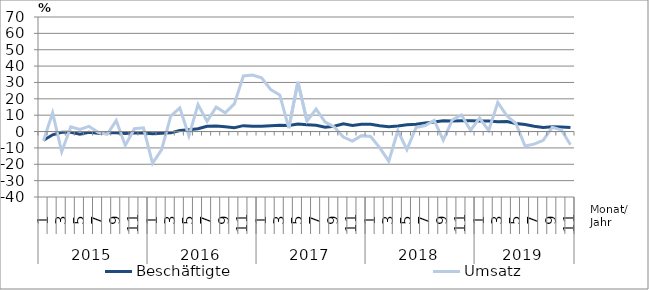
| Category | Beschäftigte | Umsatz |
|---|---|---|
| 0 | -5.3 | -5.5 |
| 1 | -2 | 11.4 |
| 2 | -0.5 | -12.4 |
| 3 | -0.5 | 2.9 |
| 4 | -1.7 | 1.3 |
| 5 | -0.5 | 3.2 |
| 6 | -1.1 | -0.5 |
| 7 | -0.8 | -1.7 |
| 8 | -0.7 | 6.7 |
| 9 | -1.2 | -8.5 |
| 10 | -0.7 | 1.7 |
| 11 | -0.9 | 2.3 |
| 12 | -1.3 | -19.4 |
| 13 | -1.1 | -11 |
| 14 | -0.8 | 9.4 |
| 15 | 0.6 | 14.4 |
| 16 | 1.1 | -2.6 |
| 17 | 1.7 | 16.5 |
| 18 | 3.2 | 6.3 |
| 19 | 3.4 | 14.9 |
| 20 | 3 | 11.4 |
| 21 | 2.4 | 16.9 |
| 22 | 3.6 | 34 |
| 23 | 3.2 | 34.5 |
| 24 | 3.3 | 32.8 |
| 25 | 3.6 | 25.7 |
| 26 | 3.9 | 22.4 |
| 27 | 3.7 | 2.1 |
| 28 | 4.6 | 30.4 |
| 29 | 4.2 | 6.4 |
| 30 | 3.8 | 13.7 |
| 31 | 2.7 | 5.8 |
| 32 | 3.3 | 2.8 |
| 33 | 4.7 | -3.4 |
| 34 | 3.7 | -5.8 |
| 35 | 4.4 | -2.5 |
| 36 | 4.5 | -3 |
| 37 | 3.6 | -9.8 |
| 38 | 2.9 | -18.1 |
| 39 | 3.4 | 0.5 |
| 40 | 4.2 | -11 |
| 41 | 4.5 | 2.5 |
| 42 | 5.3 | 3.7 |
| 43 | 5.8 | 6.8 |
| 44 | 6.6 | -5.2 |
| 45 | 6.5 | 7.1 |
| 46 | 6.6 | 10.1 |
| 47 | 6.6 | 0.8 |
| 48 | 6.4 | 8.2 |
| 49 | 6.5 | 0.6 |
| 50 | 6 | 17.8 |
| 51 | 6.1 | 9.6 |
| 52 | 4.9 | 4.9 |
| 53 | 4.3 | -8.8 |
| 54 | 3.3 | -7.7 |
| 55 | 2.5 | -5.4 |
| 56 | 3 | 2.6 |
| 57 | 2.8 | 1 |
| 58 | 2.4 | -8.1 |